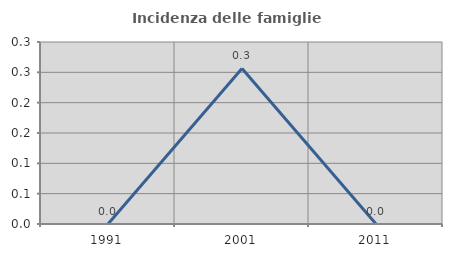
| Category | Incidenza delle famiglie numerose |
|---|---|
| 1991.0 | 0 |
| 2001.0 | 0.256 |
| 2011.0 | 0 |